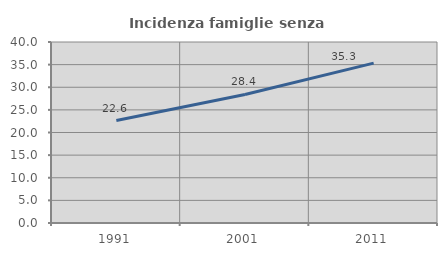
| Category | Incidenza famiglie senza nuclei |
|---|---|
| 1991.0 | 22.649 |
| 2001.0 | 28.408 |
| 2011.0 | 35.338 |